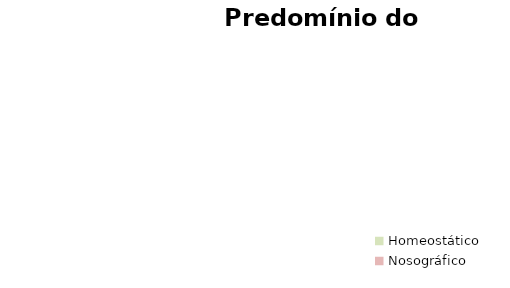
| Category | Series 0 |
|---|---|
| Homeostático | 0 |
| Nosográfico | 0 |